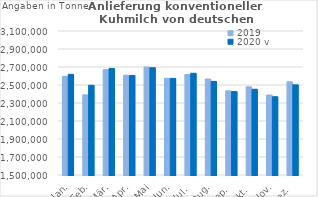
| Category | 2019 | 2020 v |
|---|---|---|
| Jan. | 2596344.611 | 2618304.169 |
| Feb. | 2390158.984 | 2497066.717 |
| Mär. | 2670479.86 | 2683292.086 |
| Apr. | 2608232.274 | 2606437.198 |
| Mai | 2699867.183 | 2691839.389 |
| Jun. | 2574550.421 | 2573443.148 |
| Jul. | 2616926.372 | 2630303.063 |
| Aug. | 2566440.526 | 2539915.843 |
| Sep. | 2434965.137 | 2427075.581 |
| Okt. | 2479427.246 | 2452872.332 |
| Nov. | 2389071.582 | 2369719.719 |
| Dez. | 2535881.864 | 2501913.622 |